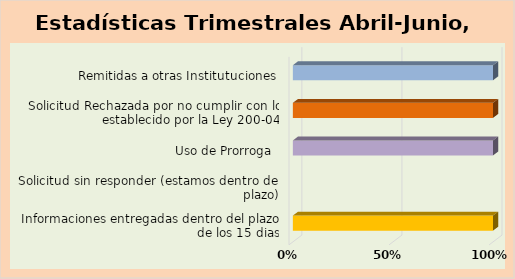
| Category | Series 0 |
|---|---|
| Informaciones entregadas dentro del plazo de los 15 dias | 0.58 |
| Solicitud sin responder (estamos dentro del plazo) | 0 |
| Uso de Prorroga  | 0.2 |
| Solicitud Rechazada por no cumplir con lo establecido por la Ley 200-04 | 0.08 |
| Remitidas a otras Institutuciones | 0.15 |